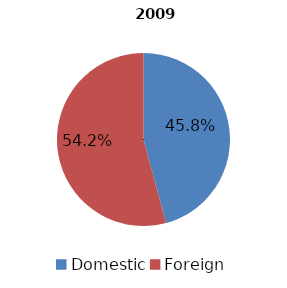
| Category | 2009 |
|---|---|
| Domestic | 503406376 |
| Foreign | 595578403 |